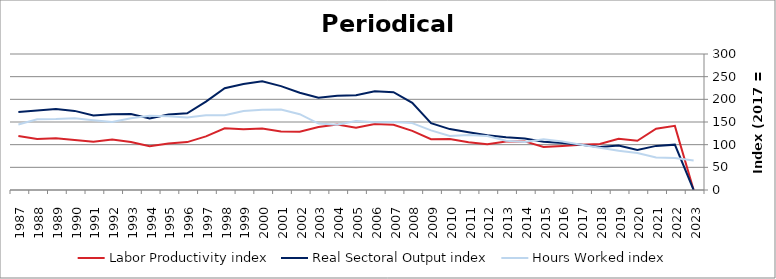
| Category | Labor Productivity index | Real Sectoral Output index | Hours Worked index |
|---|---|---|---|
| 2023.0 | 0 | 0 | 65.278 |
| 2022.0 | 141.462 | 100.05 | 70.726 |
| 2021.0 | 135.323 | 97.327 | 71.922 |
| 2020.0 | 108.6 | 88.512 | 81.503 |
| 2019.0 | 113.229 | 98.255 | 86.775 |
| 2018.0 | 101.731 | 94.891 | 93.277 |
| 2017.0 | 100 | 100 | 100 |
| 2016.0 | 97.12 | 103.706 | 106.781 |
| 2015.0 | 94.937 | 106.464 | 112.141 |
| 2014.0 | 107.219 | 113.466 | 105.826 |
| 2013.0 | 107.07 | 116.287 | 108.608 |
| 2012.0 | 101.175 | 120.682 | 119.28 |
| 2011.0 | 105.238 | 127.612 | 121.26 |
| 2010.0 | 112.545 | 134.312 | 119.341 |
| 2009.0 | 112.098 | 147.401 | 131.492 |
| 2008.0 | 130.43 | 192.415 | 147.523 |
| 2007.0 | 143.971 | 215.706 | 149.826 |
| 2006.0 | 145.793 | 217.832 | 149.412 |
| 2005.0 | 137.388 | 208.977 | 152.107 |
| 2004.0 | 144.594 | 208.027 | 143.87 |
| 2003.0 | 138.809 | 203.44 | 146.561 |
| 2002.0 | 128.336 | 214.633 | 167.242 |
| 2001.0 | 129.192 | 229.092 | 177.327 |
| 2000.0 | 135.691 | 239.877 | 176.782 |
| 1999.0 | 134.213 | 233.597 | 174.049 |
| 1998.0 | 136.166 | 224.622 | 164.962 |
| 1997.0 | 118.213 | 195.074 | 165.018 |
| 1996.0 | 105.651 | 169.11 | 160.065 |
| 1995.0 | 102.405 | 166.531 | 162.619 |
| 1994.0 | 96.433 | 157.725 | 163.558 |
| 1993.0 | 105.834 | 167.642 | 158.402 |
| 1992.0 | 111.272 | 166.851 | 149.949 |
| 1991.0 | 106.657 | 164.184 | 153.936 |
| 1990.0 | 110.416 | 174.509 | 158.047 |
| 1989.0 | 114.063 | 178.43 | 156.43 |
| 1988.0 | 112.457 | 175.601 | 156.15 |
| 1987.0 | 119.221 | 172.197 | 144.435 |